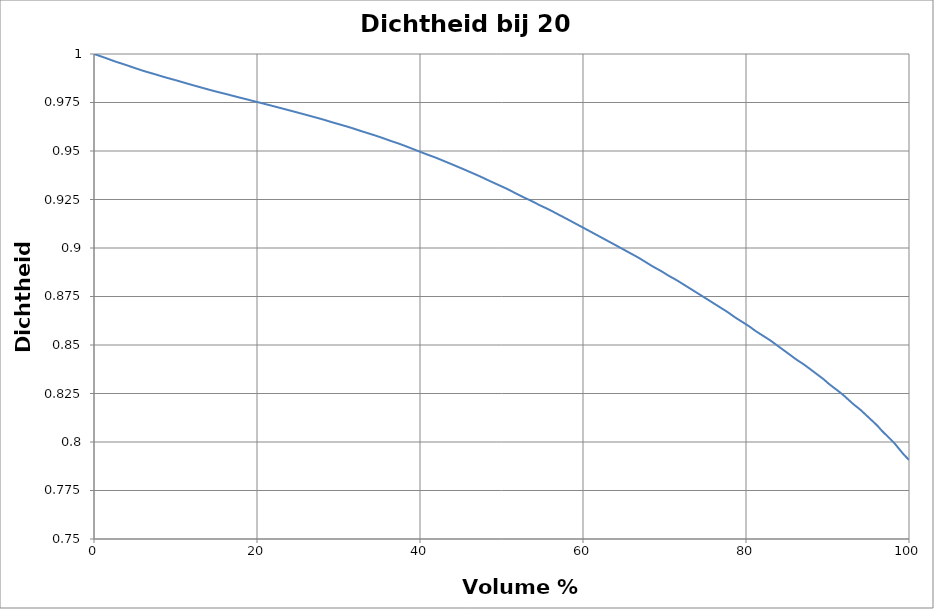
| Category | Series 0 |
|---|---|
| 0.0 | 1 |
| 1.3 | 0.998 |
| 2.5 | 0.996 |
| 3.8 | 0.995 |
| 5.0 | 0.993 |
| 6.2 | 0.991 |
| 7.5 | 0.99 |
| 8.7 | 0.988 |
| 10.0 | 0.987 |
| 11.2 | 0.985 |
| 12.4 | 0.984 |
| 13.6 | 0.982 |
| 14.8 | 0.981 |
| 16.1 | 0.979 |
| 17.3 | 0.978 |
| 18.5 | 0.977 |
| 19.7 | 0.976 |
| 20.9 | 0.974 |
| 22.1 | 0.973 |
| 23.3 | 0.972 |
| 24.5 | 0.97 |
| 25.7 | 0.969 |
| 26.9 | 0.968 |
| 28.1 | 0.966 |
| 29.2 | 0.965 |
| 30.4 | 0.963 |
| 31.6 | 0.962 |
| 32.7 | 0.96 |
| 33.9 | 0.959 |
| 35.1 | 0.957 |
| 36.2 | 0.956 |
| 37.4 | 0.954 |
| 38.5 | 0.952 |
| 39.6 | 0.95 |
| 40.7 | 0.948 |
| 41.9 | 0.947 |
| 43.0 | 0.945 |
| 44.1 | 0.943 |
| 45.2 | 0.941 |
| 46.3 | 0.939 |
| 47.4 | 0.937 |
| 48.43 | 0.935 |
| 49.51 | 0.933 |
| 50.6 | 0.931 |
| 51.6 | 0.928 |
| 52.6 | 0.926 |
| 53.7 | 0.924 |
| 54.7 | 0.922 |
| 55.8 | 0.92 |
| 56.8 | 0.918 |
| 57.8 | 0.915 |
| 58.8 | 0.913 |
| 59.8 | 0.911 |
| 60.8 | 0.909 |
| 61.8 | 0.906 |
| 62.8 | 0.904 |
| 63.8 | 0.902 |
| 64.8 | 0.9 |
| 65.8 | 0.897 |
| 66.8 | 0.895 |
| 67.7 | 0.893 |
| 68.6 | 0.89 |
| 69.6 | 0.888 |
| 70.5 | 0.886 |
| 71.5 | 0.883 |
| 72.4 | 0.881 |
| 73.3 | 0.879 |
| 74.2 | 0.876 |
| 75.1 | 0.874 |
| 76.0 | 0.872 |
| 76.9 | 0.869 |
| 77.8 | 0.867 |
| 78.6 | 0.864 |
| 79.5 | 0.862 |
| 80.4 | 0.86 |
| 81.2 | 0.857 |
| 82.1 | 0.855 |
| 83.0 | 0.852 |
| 83.8 | 0.85 |
| 84.6 | 0.847 |
| 85.4 | 0.845 |
| 86.2 | 0.842 |
| 87.1 | 0.84 |
| 87.9 | 0.837 |
| 88.7 | 0.835 |
| 89.5 | 0.832 |
| 90.2 | 0.83 |
| 91.0 | 0.827 |
| 91.8 | 0.825 |
| 92.5 | 0.822 |
| 93.2 | 0.819 |
| 94.0 | 0.817 |
| 94.7 | 0.814 |
| 95.4 | 0.811 |
| 96.1 | 0.808 |
| 96.7 | 0.806 |
| 97.4 | 0.803 |
| 98.1 | 0.8 |
| 98.7 | 0.797 |
| 99.3 | 0.794 |
| 100.0 | 0.791 |